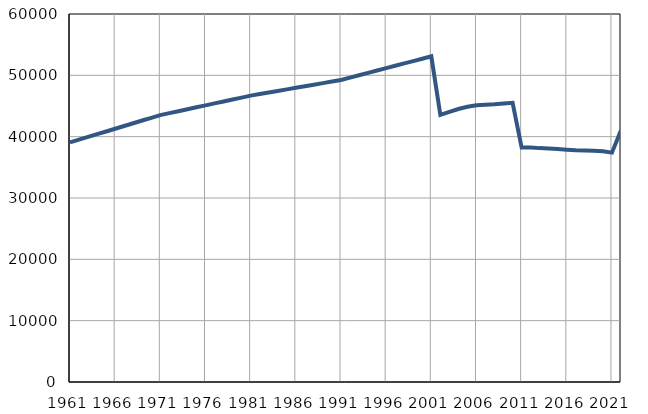
| Category | Population
size |
|---|---|
| 1961.0 | 39064 |
| 1962.0 | 39510 |
| 1963.0 | 39956 |
| 1964.0 | 40401 |
| 1965.0 | 40847 |
| 1966.0 | 41293 |
| 1967.0 | 41739 |
| 1968.0 | 42185 |
| 1969.0 | 42630 |
| 1970.0 | 43076 |
| 1971.0 | 43522 |
| 1972.0 | 43839 |
| 1973.0 | 44155 |
| 1974.0 | 44472 |
| 1975.0 | 44789 |
| 1976.0 | 45105 |
| 1977.0 | 45422 |
| 1978.0 | 45739 |
| 1979.0 | 46056 |
| 1980.0 | 46372 |
| 1981.0 | 46689 |
| 1982.0 | 46944 |
| 1983.0 | 47199 |
| 1984.0 | 47454 |
| 1985.0 | 47709 |
| 1986.0 | 47963 |
| 1987.0 | 48218 |
| 1988.0 | 48472 |
| 1989.0 | 48728 |
| 1990.0 | 48983 |
| 1991.0 | 49238 |
| 1992.0 | 49624 |
| 1993.0 | 50010 |
| 1994.0 | 50396 |
| 1995.0 | 50782 |
| 1996.0 | 51168 |
| 1997.0 | 51555 |
| 1998.0 | 51941 |
| 1999.0 | 52327 |
| 2000.0 | 52713 |
| 2001.0 | 53099 |
| 2002.0 | 43551 |
| 2003.0 | 44045 |
| 2004.0 | 44506 |
| 2005.0 | 44865 |
| 2006.0 | 45107 |
| 2007.0 | 45212 |
| 2008.0 | 45279 |
| 2009.0 | 45396 |
| 2010.0 | 45509 |
| 2011.0 | 38230 |
| 2012.0 | 38214 |
| 2013.0 | 38132 |
| 2014.0 | 38085 |
| 2015.0 | 37997 |
| 2016.0 | 37867 |
| 2017.0 | 37769 |
| 2018.0 | 37735 |
| 2019.0 | 37718 |
| 2020.0 | 37615 |
| 2021.0 | 37394 |
| 2022.0 | 41056 |